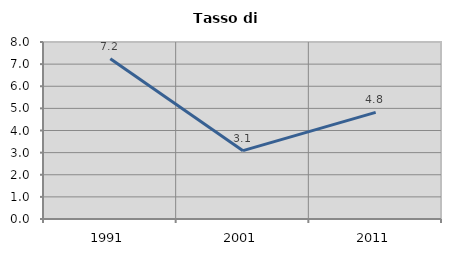
| Category | Tasso di disoccupazione   |
|---|---|
| 1991.0 | 7.24 |
| 2001.0 | 3.088 |
| 2011.0 | 4.821 |